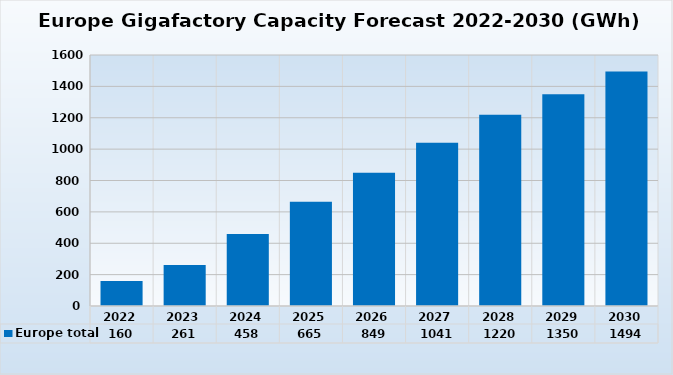
| Category | Europe total |
|---|---|
| 2022.0 | 159.955 |
| 2023.0 | 260.95 |
| 2024.0 | 458.35 |
| 2025.0 | 665.15 |
| 2026.0 | 849.15 |
| 2027.0 | 1040.95 |
| 2028.0 | 1219.75 |
| 2029.0 | 1349.65 |
| 2030.0 | 1494.45 |